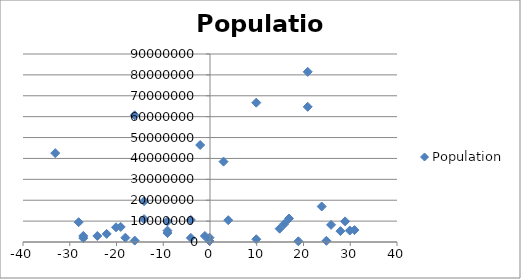
| Category | Population |
|---|---|
| 18.9 | 332529 |
| 14.899999999999999 | 6378000 |
| 20.9 | 64716000 |
| 3.8999999999999986 | 10427301 |
| -2.1000000000000014 | 46423064 |
| 9.899999999999999 | 66689000 |
| 24.9 | 562958 |
| 16.9 | 11250585 |
| 23.9 | 17000059 |
| 20.9 | 81459000 |
| 25.9 | 8211700 |
| -16.1 | 60674003 |
| 30.9 | 5707251 |
| 27.9 | 5214900 |
| 28.9 | 9875378 |
| 29.9 | 5488543 |
| 15.899999999999999 | 8662588 |
| -4.100000000000001 | 10553443 |
| 2.8999999999999986 | 38483957 |
| -1.1000000000000014 | 2875593 |
| -4.100000000000001 | 1973700 |
| 9.899999999999999 | 1315944 |
| -28.1 | 9498700 |
| -33.1 | 42539010 |
| -27.1 | 2913281 |
| -14.100000000000001 | 19511000 |
| -9.100000000000001 | 5426252 |
| -9.100000000000001 | 9855571 |
| -0.10000000000000142 | 2063077 |
| -9.100000000000001 | 4284889 |
| -22.1 | 3871643 |
| -20.1 | 7041599 |
| -16.1 | 676872 |
| -27.1 | 1859203 |
| -18.1 | 2069162 |
| -24.1 | 2886026 |
| -19.1 | 7202198 |
| -14.100000000000001 | 10955000 |
| -0.10000000000000142 | 445426 |